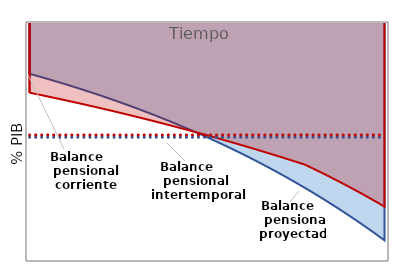
| Category | Intertemporal pension balance |
|---|---|
| 1.0 | -1.134 |
| 1.0 | -1.134 |
| 2.0 | -1.134 |
| 3.0 | -1.134 |
| 4.0 | -1.134 |
| 5.0 | -1.134 |
| 6.0 | -1.134 |
| 7.0 | -1.134 |
| 8.0 | -1.134 |
| 9.0 | -1.134 |
| 10.0 | -1.134 |
| 11.0 | -1.134 |
| 12.0 | -1.134 |
| 13.0 | -1.134 |
| 14.0 | -1.134 |
| 15.0 | -1.134 |
| 16.0 | -1.134 |
| 17.0 | -1.134 |
| 18.0 | -1.134 |
| 19.0 | -1.134 |
| 20.0 | -1.134 |
| 21.0 | -1.134 |
| 22.0 | -1.134 |
| 23.0 | -1.134 |
| 24.0 | -1.134 |
| 25.0 | -1.134 |
| 26.0 | -1.134 |
| 27.0 | -1.134 |
| 28.0 | -1.134 |
| 29.0 | -1.134 |
| 30.0 | -1.134 |
| 31.0 | -1.134 |
| 32.0 | -1.134 |
| 33.0 | -1.134 |
| 34.0 | -1.134 |
| 35.0 | -1.134 |
| 36.0 | -1.134 |
| 37.0 | -1.134 |
| 38.0 | -1.134 |
| 39.0 | -1.134 |
| 40.0 | -1.134 |
| 41.0 | -1.134 |
| 42.0 | -1.134 |
| 43.0 | -1.134 |
| 44.0 | -1.134 |
| 45.0 | -1.134 |
| 46.0 | -1.134 |
| 47.0 | -1.134 |
| 48.0 | -1.134 |
| 49.0 | -1.134 |
| 50.0 | -1.134 |